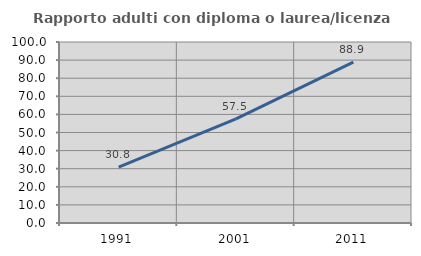
| Category | Rapporto adulti con diploma o laurea/licenza media  |
|---|---|
| 1991.0 | 30.838 |
| 2001.0 | 57.516 |
| 2011.0 | 88.889 |